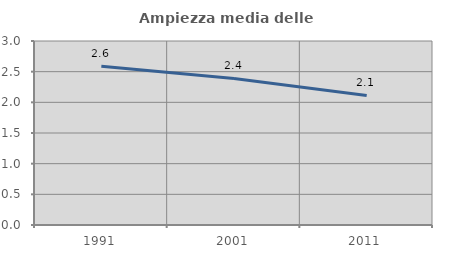
| Category | Ampiezza media delle famiglie |
|---|---|
| 1991.0 | 2.59 |
| 2001.0 | 2.389 |
| 2011.0 | 2.112 |